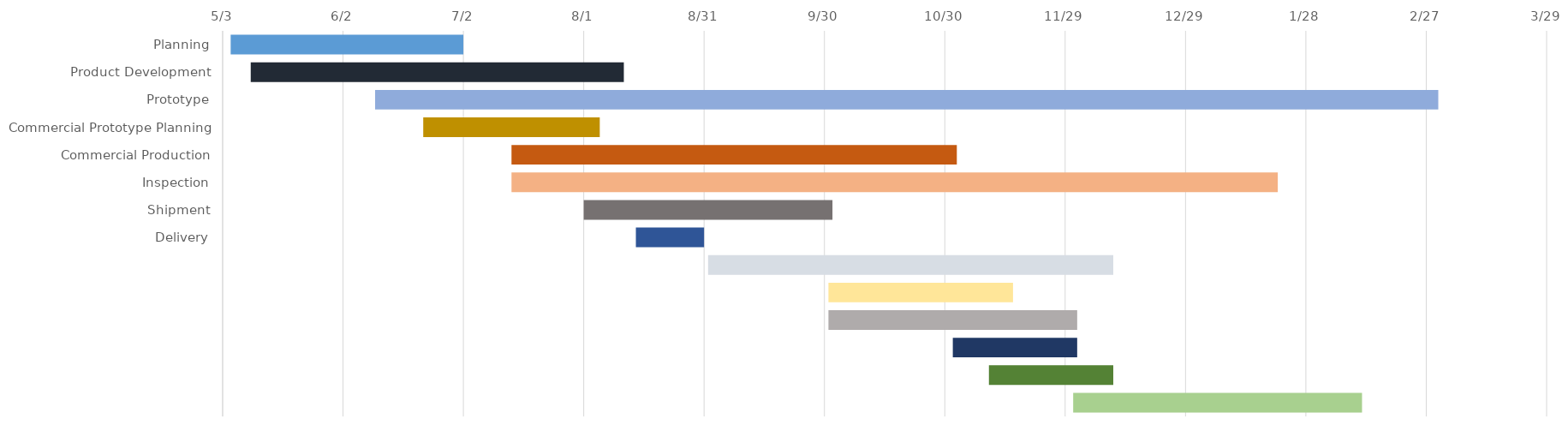
| Category | START 
DATE | Duration |
|---|---|---|
| Planning | 2025-05-05 | 58 |
| Product Development | 2025-05-10 | 93 |
| Prototype | 2025-06-10 | 265 |
| Commercial Prototype Planning | 2025-06-22 | 44 |
| Commercial Production | 2025-07-14 | 111 |
| Inspection | 2025-07-14 | 191 |
| Shipment | 2025-08-01 | 62 |
| Delivery | 2025-08-14 | 17 |